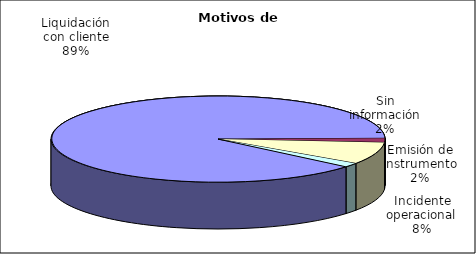
| Category | Motivos |
|---|---|
| Liquidación con cliente | 512 |
| Emisión de instrumento | 9 |
| Incidente operacional | 48 |
| Sin información | 9 |